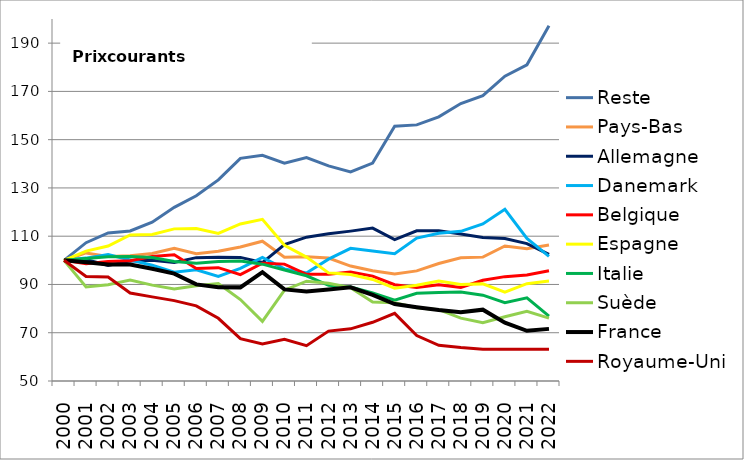
| Category | Reste | Pays-Bas | Allemagne  | Danemark | Belgique | Espagne | Italie | Suède | France | Royaume-Uni |
|---|---|---|---|---|---|---|---|---|---|---|
| 2000 | 100 | 100 | 100 | 100 | 100 | 100 | 100 | 100 | 100 | 100 |
| 2001 | 107.307 | 103.063 | 100.317 | 100.92 | 98.556 | 103.814 | 100.797 | 88.965 | 99.174 | 93.291 |
| 2002 | 111.329 | 101.569 | 97.91 | 102.431 | 99.56 | 105.951 | 101.447 | 89.855 | 98.283 | 93.095 |
| 2003 | 112.193 | 101.946 | 99.773 | 100.16 | 99.846 | 110.539 | 101.607 | 91.837 | 98.287 | 86.473 |
| 2004 | 115.799 | 102.848 | 100.01 | 97.991 | 101.566 | 110.726 | 101.172 | 89.722 | 96.544 | 84.862 |
| 2005 | 121.947 | 104.985 | 99.096 | 95.115 | 102.337 | 113.036 | 99.532 | 88.12 | 94.484 | 83.303 |
| 2006 | 126.77 | 102.732 | 101.116 | 96.101 | 96.587 | 113.19 | 98.757 | 89.498 | 90.034 | 81.145 |
| 2007 | 133.344 | 103.73 | 101.321 | 93.303 | 96.955 | 111.119 | 99.472 | 90.37 | 88.838 | 75.987 |
| 2008 | 142.273 | 105.558 | 101.224 | 96.638 | 94.055 | 115.078 | 99.767 | 83.751 | 88.796 | 67.545 |
| 2009 | 143.502 | 107.939 | 99.073 | 101.25 | 98.824 | 116.983 | 98.414 | 74.701 | 95.094 | 65.312 |
| 2010 | 140.279 | 101.289 | 106.481 | 96.463 | 98.429 | 106.214 | 96.006 | 87.662 | 87.941 | 67.255 |
| 2011 | 142.596 | 101.441 | 109.598 | 94.736 | 94.221 | 101.36 | 93.607 | 91.359 | 87.113 | 64.655 |
| 2012 | 139.162 | 100.948 | 110.997 | 100.481 | 94.256 | 94.812 | 89.628 | 90.521 | 87.884 | 70.683 |
| 2013 | 136.673 | 97.627 | 112.101 | 104.967 | 95.202 | 94.157 | 88.975 | 88.688 | 88.808 | 71.608 |
| 2014 | 140.317 | 95.652 | 113.368 | 103.864 | 93.455 | 92.093 | 86.503 | 82.747 | 85.666 | 74.325 |
| 2015 | 155.569 | 94.376 | 108.601 | 102.781 | 89.915 | 88.488 | 83.474 | 82.393 | 81.893 | 78.028 |
| 2016 | 156.13 | 95.623 | 112.235 | 109.197 | 88.764 | 89.638 | 86.327 | 80.349 | 80.587 | 68.833 |
| 2017 | 159.463 | 98.69 | 112.247 | 111.208 | 89.835 | 91.429 | 86.674 | 79.541 | 79.423 | 64.793 |
| 2018 | 164.964 | 101.063 | 110.927 | 112.008 | 88.79 | 89.972 | 86.862 | 76.053 | 78.468 | 63.896 |
| 2019 | 168.263 | 101.329 | 109.436 | 115.055 | 91.768 | 90.242 | 85.572 | 74.16 | 79.564 | 63.207 |
| 2020 | 176.287 | 105.966 | 109.02 | 121.132 | 93.242 | 86.848 | 82.416 | 76.641 | 74.186 | 63.204 |
| 2021 | 181.013 | 104.846 | 106.945 | 109.103 | 93.932 | 90.334 | 84.475 | 78.847 | 70.79 | 63.204 |
| 2022 | 197.182 | 106.343 | 102.441 | 101.651 | 95.714 | 91.409 | 76.892 | 76.039 | 71.598 | 63.204 |